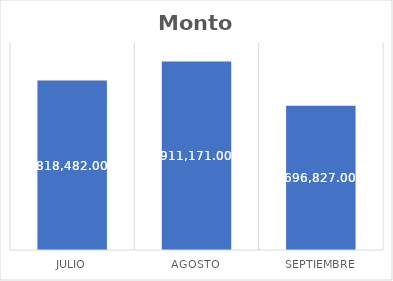
| Category | Monto Cobrado |
|---|---|
| Julio | 818482 |
| Agosto | 911171 |
| Septiembre | 696827 |